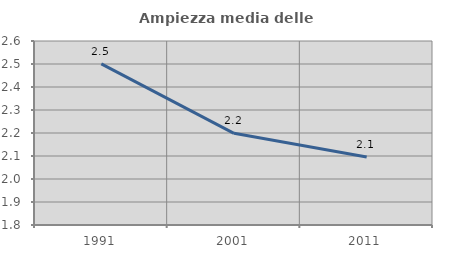
| Category | Ampiezza media delle famiglie |
|---|---|
| 1991.0 | 2.501 |
| 2001.0 | 2.199 |
| 2011.0 | 2.095 |